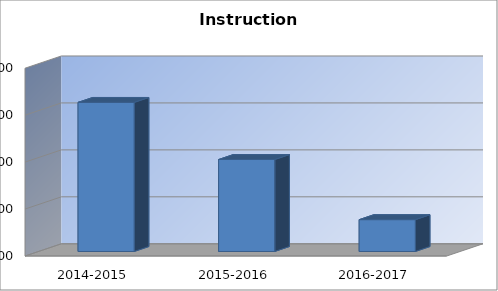
| Category | Instruction Expenditures |
|---|---|
| 2014-2015 | 1608767 |
| 2015-2016 | 1547940 |
| 2016-2017 | 1483890 |